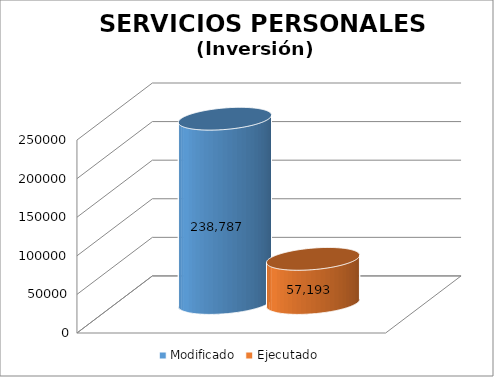
| Category | Modificado | Ejecutado |
|---|---|---|
| 0 | 238787 | 57193.1 |